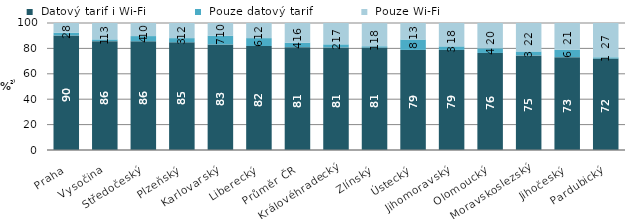
| Category |  Datový tarif i Wi-Fi |  Pouze datový tarif |  Pouze Wi-Fi |
|---|---|---|---|
|   Praha | 90.2 | 2.2 | 7.7 |
|   Vysočina | 85.7 | 1.4 | 12.9 |
|   Středočeský | 85.6 | 4.1 | 10.3 |
|   Plzeňský | 84.8 | 3.3 | 11.9 |
|   Karlovarský | 83.1 | 6.9 | 10.1 |
|   Liberecký | 81.9 | 6.2 | 11.9 |
| Průměr ČR | 81 | 3.5 | 15.5 |
|   Královéhradecký | 80.8 | 2.4 | 16.8 |
|   Zlínský | 80.7 | 1 | 18.2 |
|   Ústecký | 78.8 | 8.2 | 13 |
|   Jihomoravský | 78.8 | 2.8 | 18.4 |
|   Olomoucký | 76.4 | 3.7 | 19.9 |
|   Moravskoslezský | 74.5 | 3.1 | 22.4 |
|   Jihočeský | 73.1 | 5.9 | 21 |
|   Pardubický | 72 | 1 | 27 |